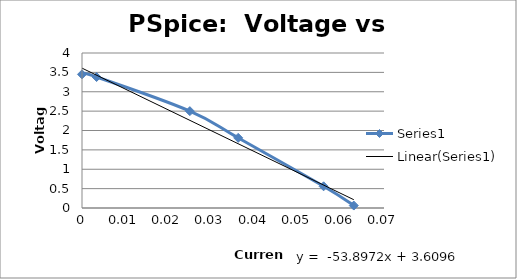
| Category | Series 0 |
|---|---|
| 0.0 | 3.45 |
| 0.0033799999999999998 | 3.38 |
| 0.025 | 2.5 |
| 0.0362 | 1.81 |
| 0.05600000000000001 | 0.56 |
| 0.063 | 0.063 |